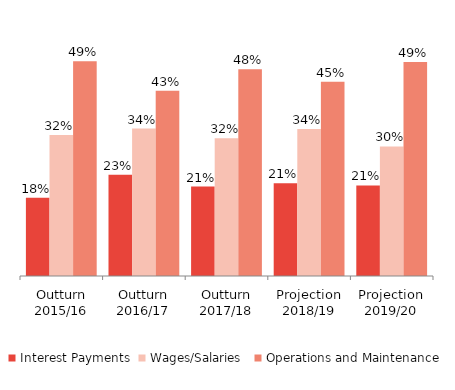
| Category | Interest Payments | Wages/Salaries  | Operations and Maintenance |
|---|---|---|---|
| Outturn 2015/16 | 0.18 | 0.325 | 0.495 |
| Outturn 2016/17 | 0.233 | 0.34 | 0.427 |
| Outturn 2017/18 | 0.206 | 0.318 | 0.476 |
| Projection 2018/19 | 0.214 | 0.339 | 0.447 |
| Projection 2019/20 | 0.209 | 0.298 | 0.493 |